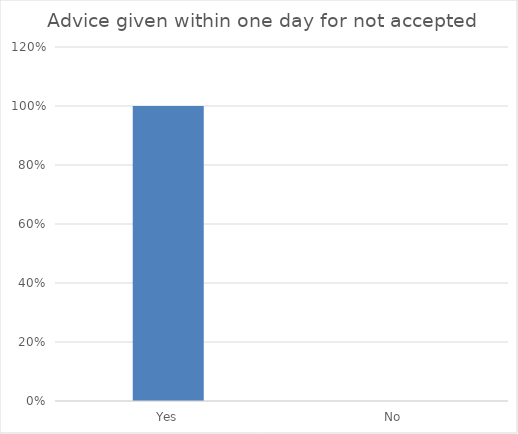
| Category | Series 0 |
|---|---|
| Yes | 1 |
| No | 0 |